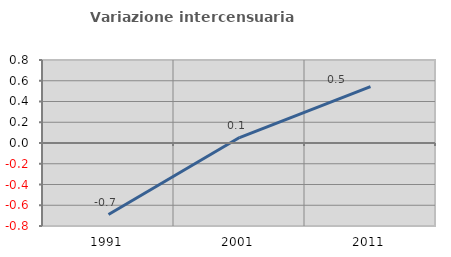
| Category | Variazione intercensuaria annua |
|---|---|
| 1991.0 | -0.69 |
| 2001.0 | 0.052 |
| 2011.0 | 0.543 |